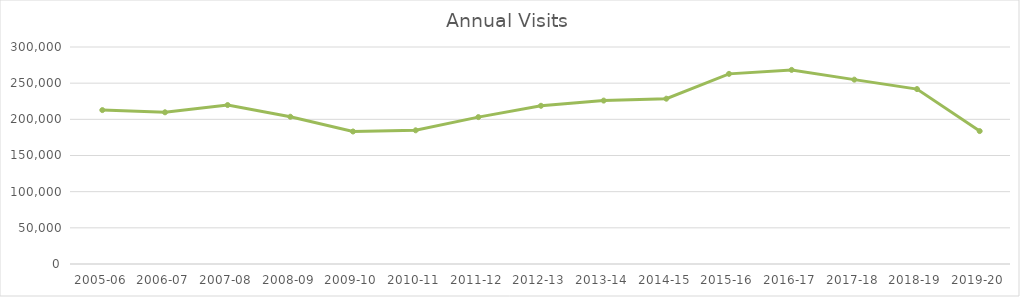
| Category | Series 0 |
|---|---|
| 2005-06 | 212770 |
| 2006-07 | 209725 |
| 2007-08 | 219750 |
| 2008-09 | 203589 |
| 2009-10 | 183186 |
| 2010-11 | 184812 |
| 2011-12 | 203074 |
| 2012-13 | 218745 |
| 2013-14 | 225912 |
| 2014-15 | 228538 |
| 2015-16 | 262865 |
| 2016-17 | 268347 |
| 2017-18 | 254873 |
| 2018-19 | 241853 |
| 2019-20 | 183752 |